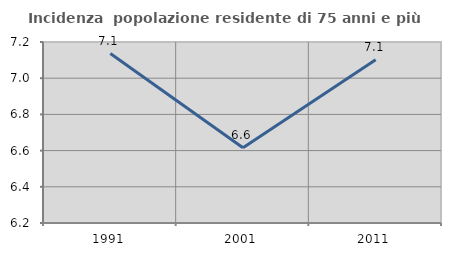
| Category | Incidenza  popolazione residente di 75 anni e più |
|---|---|
| 1991.0 | 7.136 |
| 2001.0 | 6.616 |
| 2011.0 | 7.103 |